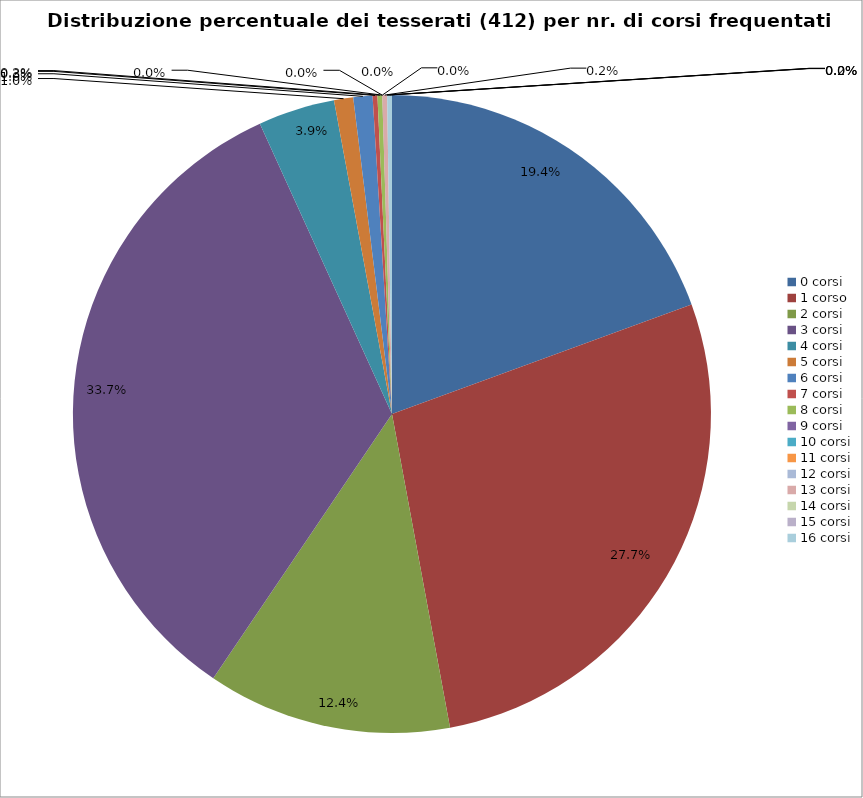
| Category | Nr. Tesserati |
|---|---|
| 0 corsi | 80 |
| 1 corso | 114 |
| 2 corsi | 51 |
| 3 corsi | 139 |
| 4 corsi | 16 |
| 5 corsi | 4 |
| 6 corsi | 4 |
| 7 corsi | 1 |
| 8 corsi | 1 |
| 9 corsi | 0 |
| 10 corsi | 0 |
| 11 corsi | 0 |
| 12 corsi | 0 |
| 13 corsi | 1 |
| 14 corsi | 0 |
| 15 corsi | 0 |
| 16 corsi | 1 |